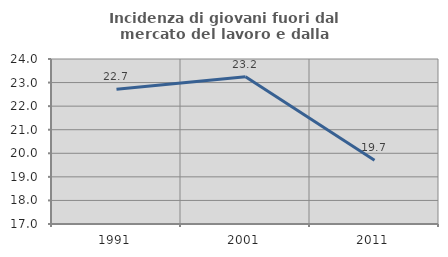
| Category | Incidenza di giovani fuori dal mercato del lavoro e dalla formazione  |
|---|---|
| 1991.0 | 22.716 |
| 2001.0 | 23.25 |
| 2011.0 | 19.702 |